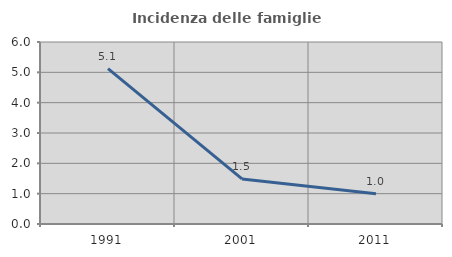
| Category | Incidenza delle famiglie numerose |
|---|---|
| 1991.0 | 5.125 |
| 2001.0 | 1.487 |
| 2011.0 | 0.995 |